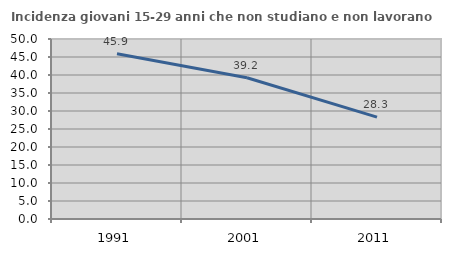
| Category | Incidenza giovani 15-29 anni che non studiano e non lavorano  |
|---|---|
| 1991.0 | 45.902 |
| 2001.0 | 39.234 |
| 2011.0 | 28.297 |